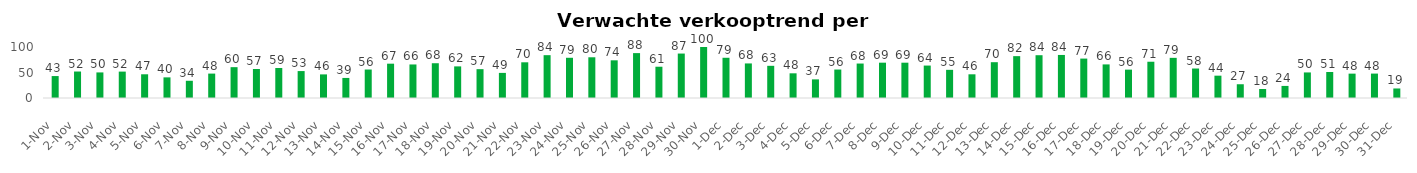
| Category | Series 1 |
|---|---|
| 2020-11-01 | 43.02 |
| 2020-11-02 | 51.92 |
| 2020-11-03 | 50.16 |
| 2020-11-04 | 51.75 |
| 2020-11-05 | 46.5 |
| 2020-11-06 | 40.46 |
| 2020-11-07 | 33.78 |
| 2020-11-08 | 47.85 |
| 2020-11-09 | 60.47 |
| 2020-11-10 | 56.91 |
| 2020-11-11 | 58.81 |
| 2020-11-12 | 52.8 |
| 2020-11-13 | 46.29 |
| 2020-11-14 | 39.33 |
| 2020-11-15 | 55.85 |
| 2020-11-16 | 67.29 |
| 2020-11-17 | 65.77 |
| 2020-11-18 | 68.17 |
| 2020-11-19 | 61.98 |
| 2020-11-20 | 56.57 |
| 2020-11-21 | 49.23 |
| 2020-11-22 | 70 |
| 2020-11-23 | 83.98 |
| 2020-11-24 | 78.86 |
| 2020-11-25 | 79.84 |
| 2020-11-26 | 73.89 |
| 2020-11-27 | 88.02 |
| 2020-11-28 | 61.32 |
| 2020-11-29 | 87.15 |
| 2020-11-30 | 100 |
| 2020-12-01 | 78.88 |
| 2020-12-02 | 67.78 |
| 2020-12-03 | 63.1 |
| 2020-12-04 | 48.41 |
| 2020-12-05 | 36.52 |
| 2020-12-06 | 55.83 |
| 2020-12-07 | 67.57 |
| 2020-12-08 | 69.26 |
| 2020-12-09 | 69.23 |
| 2020-12-10 | 63.6 |
| 2020-12-11 | 55.23 |
| 2020-12-12 | 46.46 |
| 2020-12-13 | 70.21 |
| 2020-12-14 | 82.07 |
| 2020-12-15 | 83.9 |
| 2020-12-16 | 84.41 |
| 2020-12-17 | 77.28 |
| 2020-12-18 | 65.87 |
| 2020-12-19 | 55.64 |
| 2020-12-20 | 71.11 |
| 2020-12-21 | 78.73 |
| 2020-12-22 | 57.81 |
| 2020-12-23 | 43.79 |
| 2020-12-24 | 26.97 |
| 2020-12-25 | 17.67 |
| 2020-12-26 | 23.69 |
| 2020-12-27 | 50.13 |
| 2020-12-28 | 50.98 |
| 2020-12-29 | 47.77 |
| 2020-12-30 | 47.87 |
| 2020-12-31 | 18.69 |